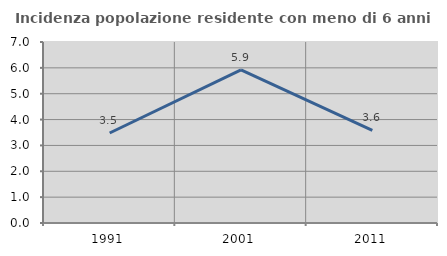
| Category | Incidenza popolazione residente con meno di 6 anni |
|---|---|
| 1991.0 | 3.481 |
| 2001.0 | 5.921 |
| 2011.0 | 3.583 |